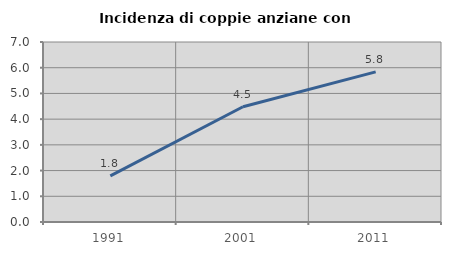
| Category | Incidenza di coppie anziane con figli |
|---|---|
| 1991.0 | 1.793 |
| 2001.0 | 4.481 |
| 2011.0 | 5.839 |